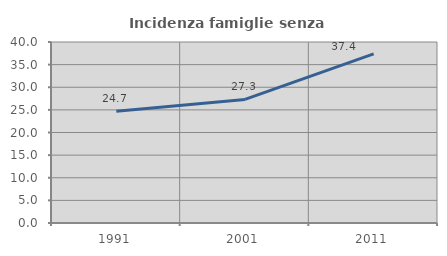
| Category | Incidenza famiglie senza nuclei |
|---|---|
| 1991.0 | 24.674 |
| 2001.0 | 27.31 |
| 2011.0 | 37.382 |